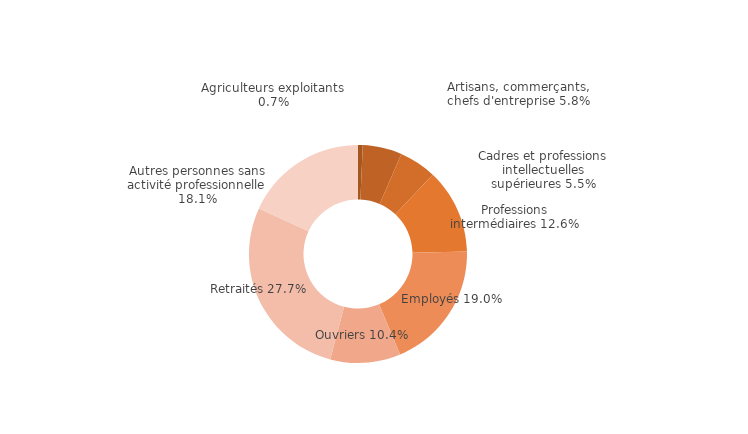
| Category | Corse du sud |
|---|---|
| Agriculteurs exploitants | 0.007 |
| Artisans, commerçants, chefs d'entreprise | 0.058 |
| Cadres et professions intellectuelles supérieures | 0.055 |
| Professions intermédiaires | 0.126 |
| Employés | 0.19 |
| Ouvriers | 0.104 |
| Retraités | 0.277 |
| Autres personnes sans activité professionnelle | 0.181 |